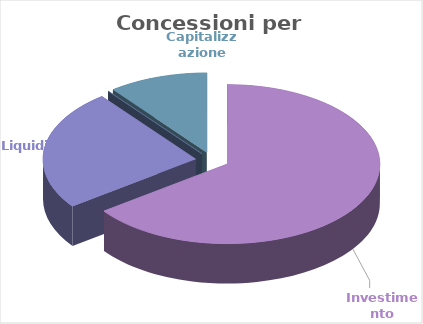
| Category | Series 0 |
|---|---|
| Investimento | 20034280 |
| Liquidità  | 7570000 |
| Consolido | 0 |
| Capitalizzazione | 3250000 |